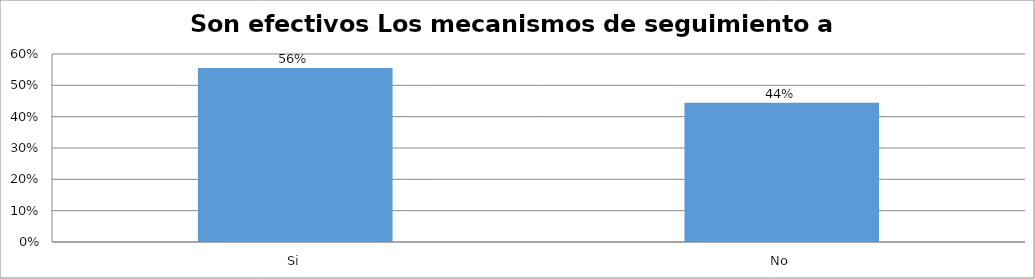
| Category | Series 0 |
|---|---|
| Si | 0.556 |
| No | 0.444 |